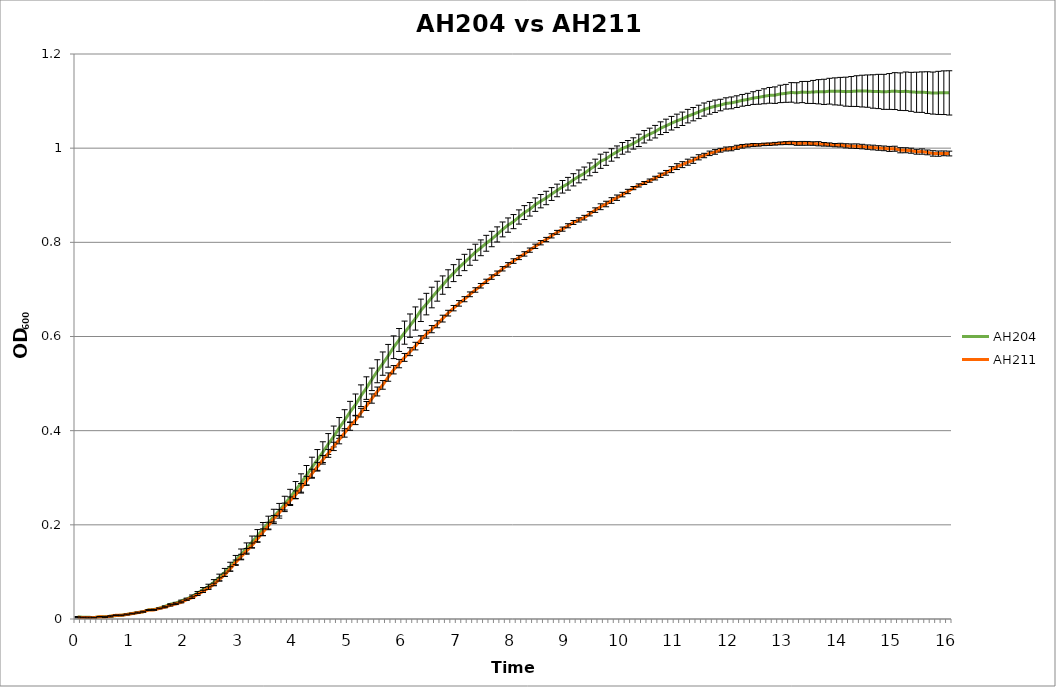
| Category | AH204 | AH211 |
|---|---|---|
| 0.0 | 0.004 | 0.004 |
| nan | 0.004 | 0.003 |
| nan | 0.004 | 0.003 |
| nan | 0.003 | 0.003 |
| nan | 0.005 | 0.005 |
| nan | 0.005 | 0.004 |
| nan | 0.006 | 0.006 |
| nan | 0.007 | 0.008 |
| nan | 0.008 | 0.008 |
| nan | 0.01 | 0.01 |
| 1.0 | 0.012 | 0.011 |
| nan | 0.014 | 0.013 |
| nan | 0.015 | 0.015 |
| nan | 0.019 | 0.019 |
| nan | 0.02 | 0.019 |
| nan | 0.023 | 0.022 |
| nan | 0.027 | 0.025 |
| nan | 0.031 | 0.029 |
| nan | 0.034 | 0.032 |
| nan | 0.038 | 0.035 |
| 2.0 | 0.042 | 0.041 |
| nan | 0.048 | 0.045 |
| nan | 0.055 | 0.052 |
| nan | 0.062 | 0.059 |
| nan | 0.069 | 0.066 |
| nan | 0.078 | 0.073 |
| nan | 0.088 | 0.084 |
| nan | 0.099 | 0.094 |
| nan | 0.111 | 0.106 |
| nan | 0.124 | 0.12 |
| 3.0 | 0.137 | 0.132 |
| nan | 0.15 | 0.145 |
| nan | 0.163 | 0.156 |
| nan | 0.176 | 0.17 |
| nan | 0.191 | 0.184 |
| nan | 0.204 | 0.198 |
| nan | 0.218 | 0.213 |
| nan | 0.23 | 0.226 |
| nan | 0.244 | 0.239 |
| nan | 0.258 | 0.251 |
| 4.0 | 0.274 | 0.264 |
| nan | 0.289 | 0.278 |
| nan | 0.305 | 0.293 |
| nan | 0.322 | 0.309 |
| nan | 0.338 | 0.323 |
| nan | 0.354 | 0.338 |
| nan | 0.372 | 0.352 |
| nan | 0.388 | 0.367 |
| nan | 0.406 | 0.381 |
| nan | 0.422 | 0.395 |
| 5.0 | 0.44 | 0.41 |
| nan | 0.455 | 0.422 |
| nan | 0.474 | 0.438 |
| nan | 0.49 | 0.452 |
| nan | 0.509 | 0.468 |
| nan | 0.526 | 0.483 |
| nan | 0.542 | 0.497 |
| nan | 0.559 | 0.514 |
| nan | 0.577 | 0.529 |
| nan | 0.593 | 0.542 |
| 6.0 | 0.608 | 0.556 |
| nan | 0.623 | 0.568 |
| nan | 0.638 | 0.58 |
| nan | 0.656 | 0.593 |
| nan | 0.669 | 0.605 |
| nan | 0.683 | 0.616 |
| nan | 0.696 | 0.626 |
| nan | 0.709 | 0.638 |
| nan | 0.723 | 0.65 |
| nan | 0.735 | 0.66 |
| 7.0 | 0.747 | 0.67 |
| nan | 0.757 | 0.679 |
| nan | 0.768 | 0.69 |
| nan | 0.779 | 0.699 |
| nan | 0.788 | 0.708 |
| nan | 0.798 | 0.717 |
| nan | 0.807 | 0.726 |
| nan | 0.817 | 0.734 |
| nan | 0.827 | 0.744 |
| nan | 0.837 | 0.752 |
| 8.0 | 0.844 | 0.76 |
| nan | 0.854 | 0.768 |
| nan | 0.863 | 0.775 |
| nan | 0.87 | 0.783 |
| nan | 0.88 | 0.792 |
| nan | 0.887 | 0.799 |
| nan | 0.894 | 0.806 |
| nan | 0.903 | 0.814 |
| nan | 0.91 | 0.821 |
| nan | 0.918 | 0.828 |
| 9.0 | 0.924 | 0.835 |
| nan | 0.933 | 0.842 |
| nan | 0.94 | 0.848 |
| nan | 0.946 | 0.852 |
| nan | 0.955 | 0.861 |
| nan | 0.963 | 0.868 |
| nan | 0.972 | 0.876 |
| nan | 0.977 | 0.881 |
| nan | 0.986 | 0.889 |
| nan | 0.992 | 0.895 |
| 10.0 | 1 | 0.901 |
| nan | 1.004 | 0.908 |
| nan | 1.01 | 0.915 |
| nan | 1.017 | 0.921 |
| nan | 1.024 | 0.926 |
| nan | 1.03 | 0.931 |
| nan | 1.035 | 0.936 |
| nan | 1.042 | 0.942 |
| nan | 1.047 | 0.948 |
| nan | 1.053 | 0.954 |
| 11.0 | 1.058 | 0.961 |
| nan | 1.062 | 0.965 |
| nan | 1.068 | 0.97 |
| nan | 1.072 | 0.974 |
| nan | 1.077 | 0.981 |
| nan | 1.082 | 0.984 |
| nan | 1.086 | 0.989 |
| nan | 1.089 | 0.992 |
| nan | 1.092 | 0.996 |
| nan | 1.095 | 0.998 |
| 12.0 | 1.096 | 0.999 |
| nan | 1.099 | 1.002 |
| nan | 1.102 | 1.004 |
| nan | 1.104 | 1.006 |
| nan | 1.106 | 1.007 |
| nan | 1.108 | 1.007 |
| nan | 1.11 | 1.008 |
| nan | 1.112 | 1.008 |
| nan | 1.113 | 1.009 |
| nan | 1.115 | 1.01 |
| 13.0 | 1.116 | 1.011 |
| nan | 1.118 | 1.011 |
| nan | 1.117 | 1.01 |
| nan | 1.119 | 1.01 |
| nan | 1.118 | 1.01 |
| nan | 1.119 | 1.01 |
| nan | 1.12 | 1.009 |
| nan | 1.12 | 1.008 |
| nan | 1.121 | 1.008 |
| nan | 1.121 | 1.006 |
| 14.0 | 1.121 | 1.006 |
| nan | 1.12 | 1.005 |
| nan | 1.12 | 1.004 |
| nan | 1.121 | 1.004 |
| nan | 1.121 | 1.003 |
| nan | 1.121 | 1.002 |
| nan | 1.12 | 1.001 |
| nan | 1.12 | 1 |
| nan | 1.12 | 1 |
| nan | 1.12 | 0.998 |
| 15.0 | 1.121 | 0.999 |
| nan | 1.12 | 0.996 |
| nan | 1.121 | 0.996 |
| nan | 1.12 | 0.995 |
| nan | 1.119 | 0.992 |
| nan | 1.119 | 0.993 |
| nan | 1.118 | 0.991 |
| nan | 1.117 | 0.989 |
| nan | 1.117 | 0.988 |
| nan | 1.118 | 0.989 |
| 16.0 | 1.117 | 0.989 |